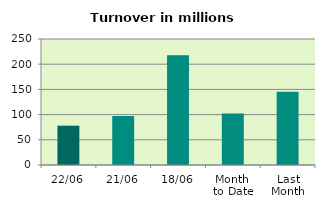
| Category | Series 0 |
|---|---|
| 22/06 | 78.031 |
| 21/06 | 97.357 |
| 18/06 | 217.623 |
| Month 
to Date | 102.078 |
| Last
Month | 145.388 |